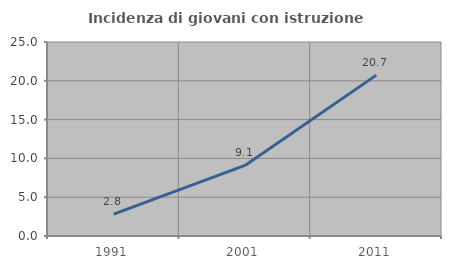
| Category | Incidenza di giovani con istruzione universitaria |
|---|---|
| 1991.0 | 2.83 |
| 2001.0 | 9.091 |
| 2011.0 | 20.732 |